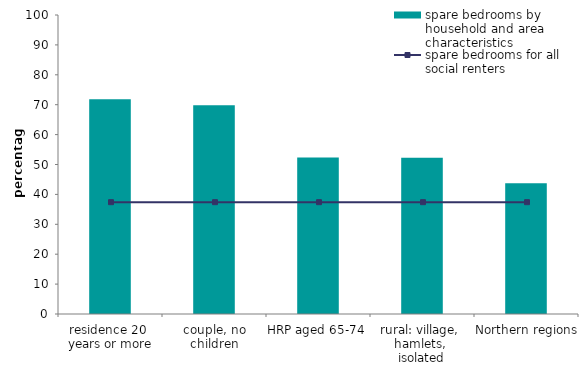
| Category | spare bedrooms by household and area characteristics |
|---|---|
| residence 20 
years or more | 71.845 |
| couple, no children | 69.844 |
| HRP aged 65-74 | 52.375 |
| rural: village, 
hamlets, 
isolated dwellings | 52.281 |
| Northern regions | 43.75 |